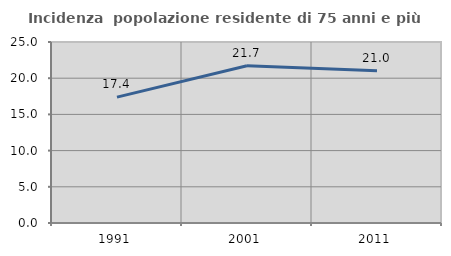
| Category | Incidenza  popolazione residente di 75 anni e più |
|---|---|
| 1991.0 | 17.391 |
| 2001.0 | 21.718 |
| 2011.0 | 21.026 |